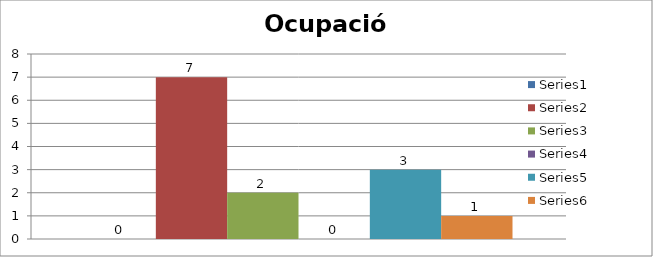
| Category | Series 0 | Series 1 | Series 2 | Series 3 | Series 4 | Series 5 |
|---|---|---|---|---|---|---|
| 0 | 0 | 7 | 2 | 0 | 3 | 1 |